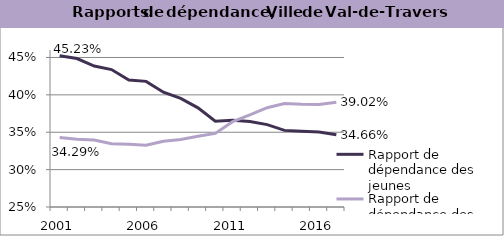
| Category | Rapport de dépendance des jeunes | Rapport de dépendance des personnes âgées |
|---|---|---|
| 2001.0 | 0.452 | 0.343 |
| 2002.0 | 0.449 | 0.341 |
| 2003.0 | 0.439 | 0.339 |
| 2004.0 | 0.434 | 0.335 |
| 2005.0 | 0.42 | 0.334 |
| 2006.0 | 0.418 | 0.332 |
| 2007.0 | 0.403 | 0.338 |
| 2008.0 | 0.395 | 0.34 |
| 2009.0 | 0.383 | 0.345 |
| 2010.0 | 0.365 | 0.348 |
| 2011.0 | 0.366 | 0.364 |
| 2012.0 | 0.364 | 0.373 |
| 2013.0 | 0.36 | 0.383 |
| 2014.0 | 0.352 | 0.388 |
| 2015.0 | 0.351 | 0.387 |
| 2016.0 | 0.35 | 0.387 |
| 2017.0 | 0.347 | 0.39 |